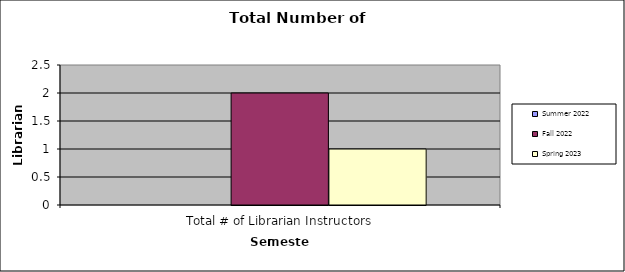
| Category | Summer 2022 | Fall 2022 | Spring 2023 |
|---|---|---|---|
| Total # of Librarian Instructors | 0 | 2 | 1 |